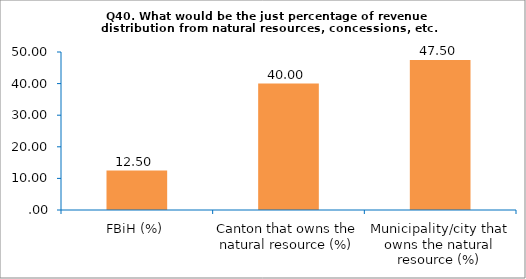
| Category | Series 0 |
|---|---|
| FBiH (%) | 12.5 |
| Canton that owns the natural resource (%) | 40 |
| Municipality/city that owns the natural resource (%) | 47.5 |